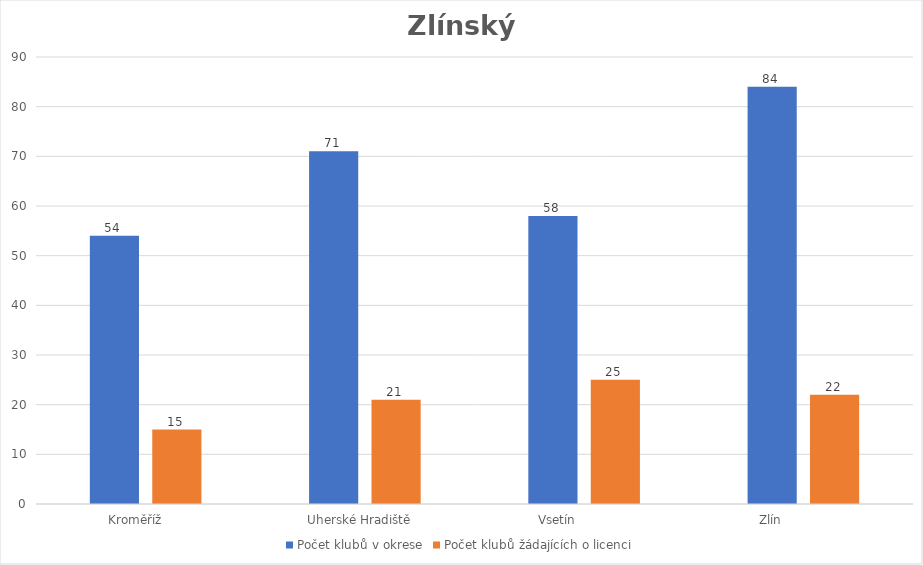
| Category | Počet klubů v okrese | Počet klubů žádajících o licenci |
|---|---|---|
| Kroměříž      | 54 | 15 |
| Uherské Hradiště   | 71 | 21 |
| Vsetín              | 58 | 25 |
| Zlín                 | 84 | 22 |